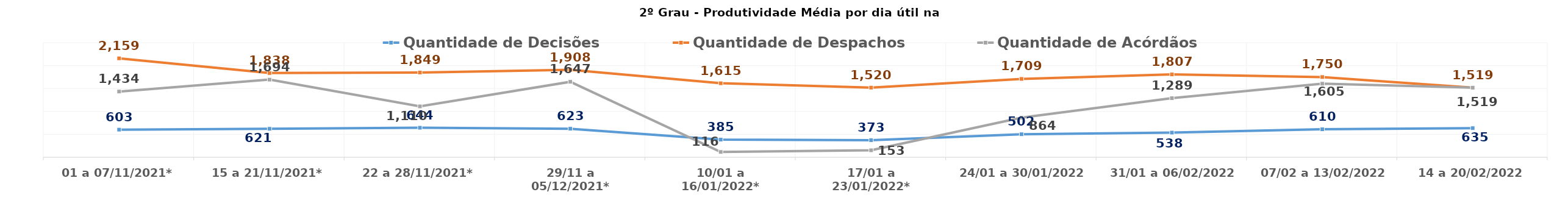
| Category | Quantidade de Decisões | Quantidade de Despachos | Quantidade de Acórdãos |
|---|---|---|---|
| 01 a 07/11/2021* | 603 | 2159 | 1434 |
| 15 a 21/11/2021* | 621.25 | 1837.5 | 1694 |
| 22 a 28/11/2021* | 644.4 | 1849.2 | 1110.4 |
| 29/11 a 05/12/2021* | 622.8 | 1908 | 1646.8 |
| 10/01 a 16/01/2022* | 385.4 | 1614.8 | 115.8 |
| 17/01 a 23/01/2022* | 373.2 | 1520.2 | 152.8 |
| 24/01 a 30/01/2022 | 502.4 | 1709.4 | 863.6 |
| 31/01 a 06/02/2022 | 538 | 1807 | 1289.2 |
| 07/02 a 13/02/2022 | 610.4 | 1750.2 | 1604.6 |
| 14 a 20/02/2022 | 635.2 | 1518.8 | 1518.8 |